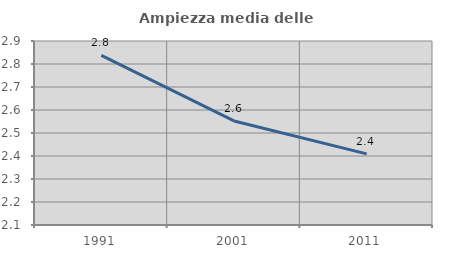
| Category | Ampiezza media delle famiglie |
|---|---|
| 1991.0 | 2.837 |
| 2001.0 | 2.552 |
| 2011.0 | 2.409 |